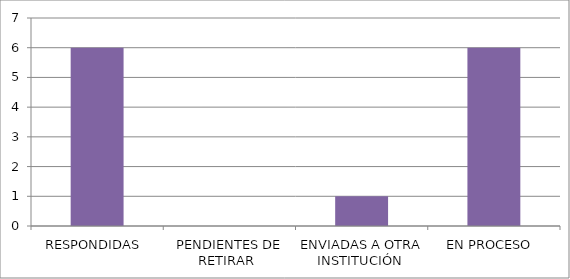
| Category | Series 0 |
|---|---|
| RESPONDIDAS  | 6 |
| PENDIENTES DE RETIRAR  | 0 |
| ENVIADAS A OTRA INSTITUCIÓN  | 1 |
| EN PROCESO  | 6 |